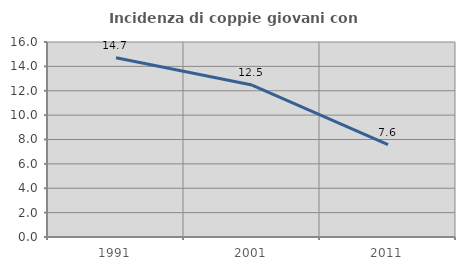
| Category | Incidenza di coppie giovani con figli |
|---|---|
| 1991.0 | 14.706 |
| 2001.0 | 12.465 |
| 2011.0 | 7.587 |